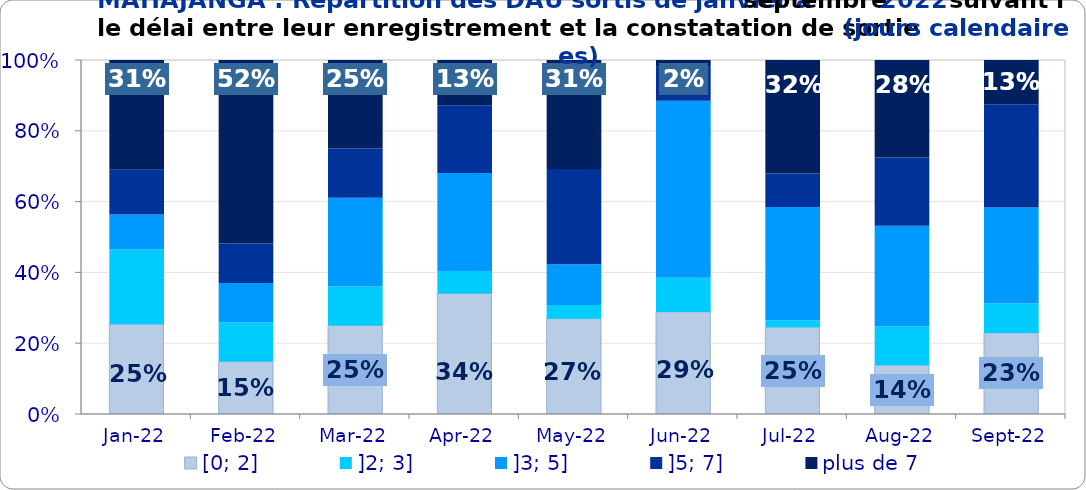
| Category | [0; 2] | ]2; 3] | ]3; 5] | ]5; 7] | plus de 7 |
|---|---|---|---|---|---|
| 2022-01-01 | 0.254 | 0.211 | 0.099 | 0.127 | 0.31 |
| 2022-02-01 | 0.148 | 0.111 | 0.111 | 0.111 | 0.519 |
| 2022-03-01 | 0.25 | 0.111 | 0.25 | 0.139 | 0.25 |
| 2022-04-01 | 0.34 | 0.064 | 0.277 | 0.191 | 0.128 |
| 2022-05-01 | 0.269 | 0.038 | 0.115 | 0.269 | 0.308 |
| 2022-06-01 | 0.288 | 0.096 | 0.5 | 0.096 | 0.019 |
| 2022-07-01 | 0.245 | 0.019 | 0.321 | 0.094 | 0.321 |
| 2022-08-01 | 0.138 | 0.11 | 0.284 | 0.193 | 0.275 |
| 2022-09-01 | 0.229 | 0.083 | 0.271 | 0.292 | 0.125 |